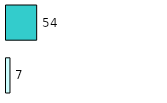
| Category | Series 0 | Series 1 |
|---|---|---|
| 0 | 7 | 54 |